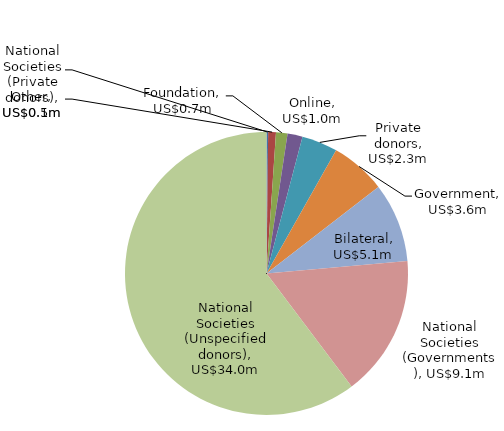
| Category | Series 0 |
|---|---|
| National Societies (Private donors) | 0.106 |
| Other | 0.5 |
| Foundation | 0.74 |
| Online | 0.968 |
| Private donors | 2.309 |
| Government | 3.572 |
| Bilateral | 5.124 |
| National Societies (Governments) | 9.11 |
| National Societies (Unspecified donors) | 34.022 |